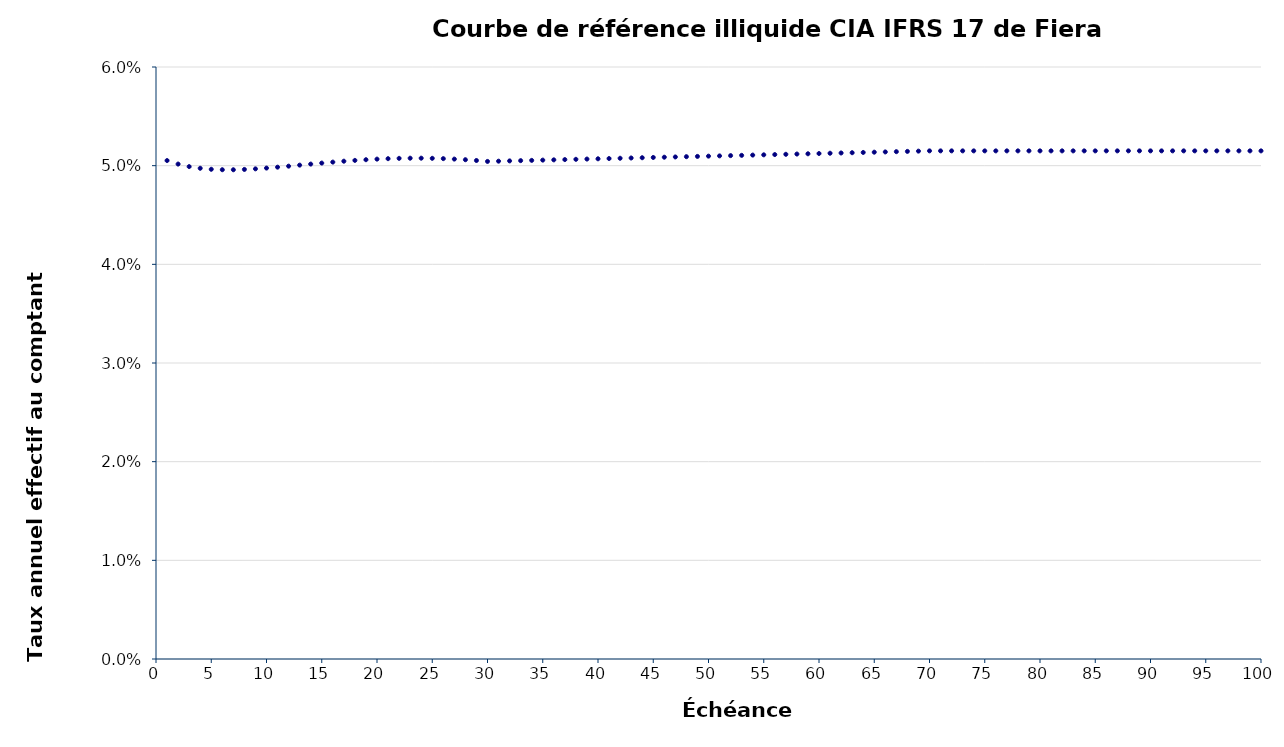
| Category | Taux annuel effectif au comptant (spot) |
|---|---|
| 1.0 | 0.051 |
| 2.0 | 0.05 |
| 3.0 | 0.05 |
| 4.0 | 0.05 |
| 5.0 | 0.05 |
| 6.0 | 0.05 |
| 7.0 | 0.05 |
| 8.0 | 0.05 |
| 9.0 | 0.05 |
| 10.0 | 0.05 |
| 11.0 | 0.05 |
| 12.0 | 0.05 |
| 13.0 | 0.05 |
| 14.0 | 0.05 |
| 15.0 | 0.05 |
| 16.0 | 0.05 |
| 17.0 | 0.05 |
| 18.0 | 0.051 |
| 19.0 | 0.051 |
| 20.0 | 0.051 |
| 21.0 | 0.051 |
| 22.0 | 0.051 |
| 23.0 | 0.051 |
| 24.0 | 0.051 |
| 25.0 | 0.051 |
| 26.0 | 0.051 |
| 27.0 | 0.051 |
| 28.0 | 0.051 |
| 29.0 | 0.051 |
| 30.0 | 0.05 |
| 31.0 | 0.05 |
| 32.0 | 0.05 |
| 33.0 | 0.051 |
| 34.0 | 0.051 |
| 35.0 | 0.051 |
| 36.0 | 0.051 |
| 37.0 | 0.051 |
| 38.0 | 0.051 |
| 39.0 | 0.051 |
| 40.0 | 0.051 |
| 41.0 | 0.051 |
| 42.0 | 0.051 |
| 43.0 | 0.051 |
| 44.0 | 0.051 |
| 45.0 | 0.051 |
| 46.0 | 0.051 |
| 47.0 | 0.051 |
| 48.0 | 0.051 |
| 49.0 | 0.051 |
| 50.0 | 0.051 |
| 51.0 | 0.051 |
| 52.0 | 0.051 |
| 53.0 | 0.051 |
| 54.0 | 0.051 |
| 55.0 | 0.051 |
| 56.0 | 0.051 |
| 57.0 | 0.051 |
| 58.0 | 0.051 |
| 59.0 | 0.051 |
| 60.0 | 0.051 |
| 61.0 | 0.051 |
| 62.0 | 0.051 |
| 63.0 | 0.051 |
| 64.0 | 0.051 |
| 65.0 | 0.051 |
| 66.0 | 0.051 |
| 67.0 | 0.051 |
| 68.0 | 0.051 |
| 69.0 | 0.051 |
| 70.0 | 0.052 |
| 71.0 | 0.052 |
| 72.0 | 0.052 |
| 73.0 | 0.052 |
| 74.0 | 0.052 |
| 75.0 | 0.052 |
| 76.0 | 0.052 |
| 77.0 | 0.052 |
| 78.0 | 0.052 |
| 79.0 | 0.052 |
| 80.0 | 0.052 |
| 81.0 | 0.052 |
| 82.0 | 0.052 |
| 83.0 | 0.052 |
| 84.0 | 0.052 |
| 85.0 | 0.052 |
| 86.0 | 0.052 |
| 87.0 | 0.052 |
| 88.0 | 0.052 |
| 89.0 | 0.052 |
| 90.0 | 0.052 |
| 91.0 | 0.052 |
| 92.0 | 0.052 |
| 93.0 | 0.052 |
| 94.0 | 0.052 |
| 95.0 | 0.052 |
| 96.0 | 0.052 |
| 97.0 | 0.052 |
| 98.0 | 0.052 |
| 99.0 | 0.052 |
| 100.0 | 0.052 |